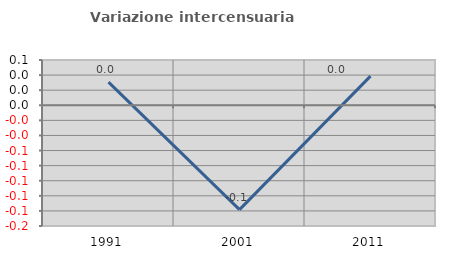
| Category | Variazione intercensuaria annua |
|---|---|
| 1991.0 | 0.031 |
| 2001.0 | -0.138 |
| 2011.0 | 0.039 |